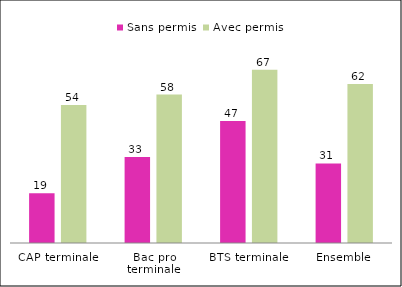
| Category | Sans permis | Avec permis |
|---|---|---|
| CAP terminale | 19.34 | 53.6 |
| Bac pro terminale | 33.44 | 57.65 |
| BTS terminale | 47.41 | 67.33 |
| Ensemble | 30.88 | 61.71 |